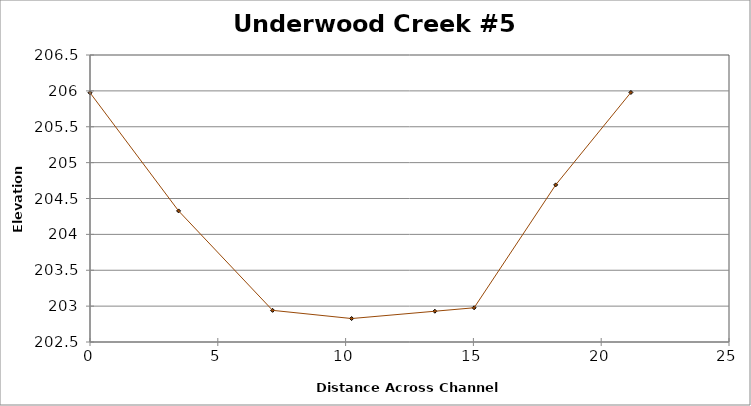
| Category | Series 0 |
|---|---|
| 0.0 | 205.974 |
| 3.4657054108750738 | 204.327 |
| 7.144148094158484 | 202.941 |
| 10.235289638686217 | 202.827 |
| 13.492227576843476 | 202.929 |
| 15.028177301256111 | 202.977 |
| 18.220098792007065 | 204.69 |
| 21.161977837606678 | 205.978 |